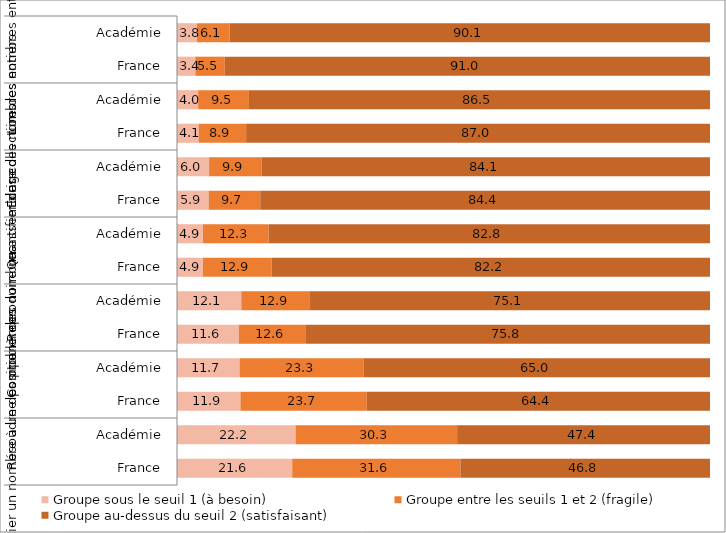
| Category | Groupe sous le seuil 1 (à besoin) | Groupe entre les seuils 1 et 2 (fragile) | Groupe au-dessus du seuil 2 (satisfaisant) |
|---|---|---|---|
| 0 | 21.62 | 31.55 | 46.83 |
| 1 | 22.24 | 30.32 | 47.44 |
| 2 | 11.9 | 23.71 | 64.39 |
| 3 | 11.74 | 23.31 | 64.96 |
| 4 | 11.59 | 12.61 | 75.81 |
| 5 | 12.06 | 12.9 | 75.05 |
| 6 | 4.87 | 12.89 | 82.24 |
| 7 | 4.88 | 12.29 | 82.83 |
| 8 | 5.94 | 9.68 | 84.38 |
| 9 | 6.03 | 9.88 | 84.08 |
| 10 | 4.06 | 8.91 | 87.03 |
| 11 | 3.97 | 9.53 | 86.5 |
| 12 | 3.44 | 5.53 | 91.03 |
| 13 | 3.76 | 6.1 | 90.14 |